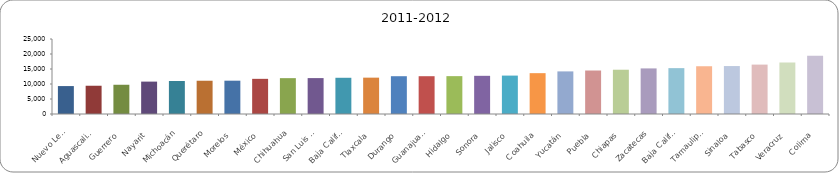
| Category | 2011-2012 |
|---|---|
| Nuevo León | 9308.819 |
| Aguascalientes | 9419.216 |
| Guerrero | 9747.022 |
| Nayarit | 10797.182 |
| Michoacán | 10993.219 |
| Querétaro | 11088.22 |
| Morelos | 11105.464 |
| México | 11719.53 |
| Chihuahua | 11950.034 |
| San Luis Potosí | 11967.746 |
| Baja California | 12074.761 |
| Tlaxcala | 12116.403 |
| Durango | 12598.445 |
| Guanajuato | 12598.445 |
| Hidalgo | 12620.302 |
| Sonora | 12727.125 |
| Jalisco | 12803.663 |
| Coahuila | 13613.904 |
| Yucatán | 14202.344 |
| Puebla | 14497.917 |
| Chiapas | 14758.055 |
| Zacatecas | 15198.61 |
| Baja California Sur | 15289.148 |
| Tamaulipas | 15917.937 |
| Sinaloa | 15983.311 |
| Tabasco | 16464.181 |
| Veracruz | 17164.4 |
| Colima | 19376.238 |